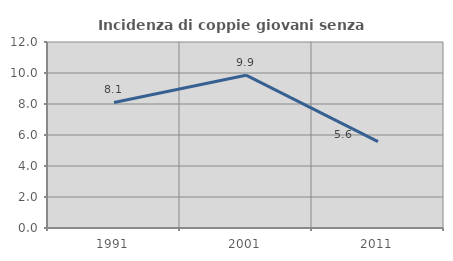
| Category | Incidenza di coppie giovani senza figli |
|---|---|
| 1991.0 | 8.101 |
| 2001.0 | 9.859 |
| 2011.0 | 5.567 |